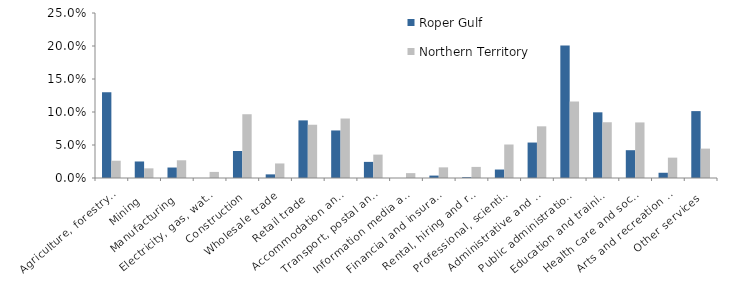
| Category | Roper Gulf | Northern Territory |
|---|---|---|
| Agriculture, forestry and fishing | 0.13 | 0.026 |
| Mining | 0.025 | 0.015 |
| Manufacturing | 0.016 | 0.027 |
| Electricity, gas, water and waste services | 0 | 0.009 |
| Construction | 0.041 | 0.097 |
| Wholesale trade | 0.005 | 0.022 |
| Retail trade | 0.087 | 0.081 |
| Accommodation and food services | 0.072 | 0.09 |
| Transport, postal and warehousing | 0.024 | 0.035 |
| Information media and telecommunications | 0 | 0.007 |
| Financial and insurance services | 0.004 | 0.016 |
| Rental, hiring and real estate services | 0.001 | 0.017 |
| Professional, scientific and technical services | 0.013 | 0.051 |
| Administrative and support services | 0.054 | 0.078 |
| Public administration and safety | 0.201 | 0.116 |
| Education and training | 0.1 | 0.084 |
| Health care and social assistance | 0.042 | 0.084 |
| Arts and recreation services | 0.008 | 0.031 |
| Other services | 0.101 | 0.045 |